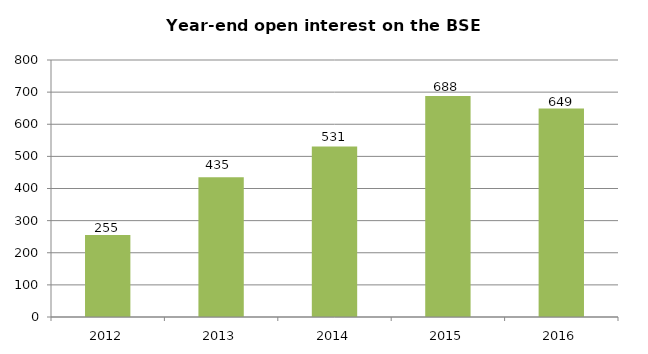
| Category | BSE contracts (thousands) |
|---|---|
| 2012.0 | 255 |
| 2013.0 | 435 |
| 2014.0 | 531 |
| 2015.0 | 688.194 |
| 2016.0 | 648.876 |